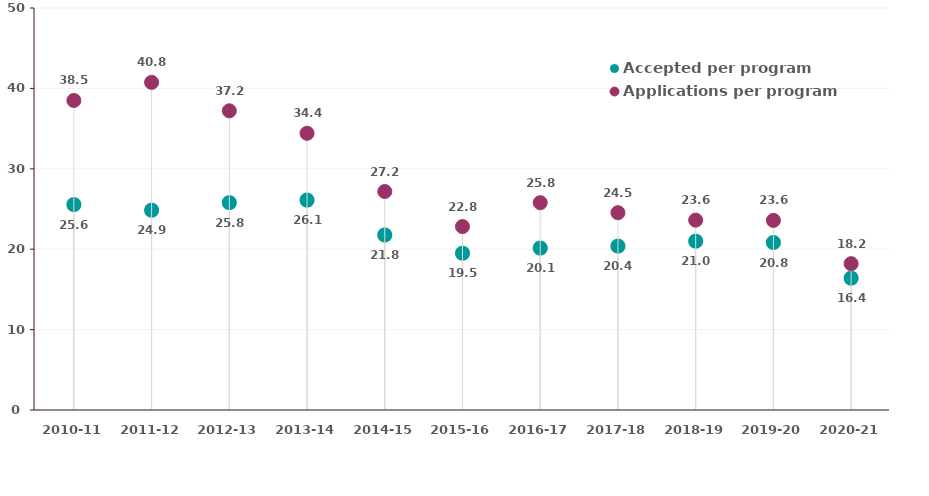
| Category | Accepted per program | Applications per program |
|---|---|---|
| 2010-11 | 25.55 | 38.5 |
| 2011-12 | 24.85 | 40.75 |
| 2012-13 | 25.789 | 37.211 |
| 2013-14 | 26.105 | 34.421 |
| 2014-15 | 21.765 | 27.176 |
| 2015-16 | 19.5 | 22.812 |
| 2016-17 | 20.143 | 25.786 |
| 2017-18 | 20.385 | 24.538 |
| 2018-19 | 21 | 23.615 |
| 2019-20 | 20.833 | 23.583 |
| 2020-21 | 16.4 | 18.2 |